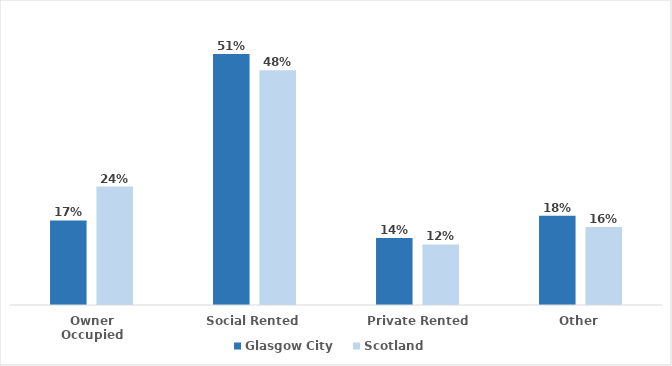
| Category | Glasgow City | Scotland |
|---|---|---|
| Owner Occupied | 0.172 | 0.241 |
| Social Rented | 0.51 | 0.477 |
| Private Rented | 0.136 | 0.123 |
| Other | 0.182 | 0.159 |